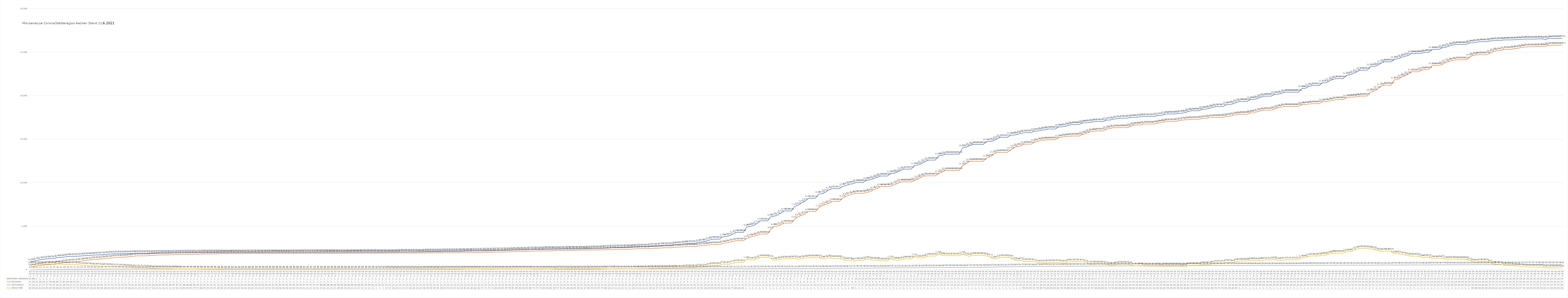
| Category | Positiv Getestete | Genesene | Verstorbene | Aktive Fälle |
|---|---|---|---|---|
| 3/31/20 | 922 | 322 | 15 | 585 |
| 4/1/20 | 980 | 364 | 16 | 600 |
| 4/2/20 | 1081 | 435 | 21 | 625 |
| 4/3/20 | 1155 | 494 | 27 | 634 |
| 4/4/20 | 1213 | 560 | 27 | 626 |
| 4/5/20 | 1259 | 578 | 27 | 654 |
| 4/6/20 | 1272 | 595 | 35 | 642 |
| 4/7/20 | 1295 | 662 | 35 | 598 |
| 4/8/20 | 1399 | 699 | 36 | 664 |
| 4/9/20 | 1426 | 755 | 41 | 630 |
| 4/10/20 | 1465 | 826 | 48 | 591 |
| 4/11/20 | 1508 | 854 | 50 | 604 |
| 4/12/20 | 1532 | 906 | 51 | 575 |
| 4/13/20 | 1547 | 922 | 51 | 574 |
| 4/14/20 | 1557 | 949 | 52 | 556 |
| 4/15/20 | 1583 | 1009 | 54 | 520 |
| 4/16/20 | 1623 | 1058 | 56 | 509 |
| 4/17/20 | 1650 | 1112 | 59 | 479 |
| 4/18/20 | 1669 | 1159 | 62 | 448 |
| 4/19/20 | 1693 | 1195 | 62 | 436 |
| 4/20/20 | 1707 | 1201 | 63 | 443 |
| 4/21/20 | 1719 | 1256 | 65 | 398 |
| 4/22/20 | 1754 | 1281 | 70 | 403 |
| 4/23/20 | 1797 | 1324 | 73 | 400 |
| 4/24/20 | 1812 | 1357 | 74 | 381 |
| 4/25/20 | 1824 | 1412 | 75 | 337 |
| 4/26/20 | 1835 | 1420 | 76 | 339 |
| 4/27/20 | 1839 | 1435 | 76 | 328 |
| 4/28/20 | 1845 | 1467 | 78 | 300 |
| 4/29/20 | 1853 | 1490 | 79 | 284 |
| 4/30/20 | 1866 | 1535 | 82 | 249 |
| 5/1/20 | 1891 | 1591 | 83 | 217 |
| 5/2/20 | 1891 | 1591 | 83 | 217 |
| 5/3/20 | 1891 | 1591 | 83 | 217 |
| 5/4/20 | 1885 | 1598 | 83 | 204 |
| 5/5/20 | 1890 | 1636 | 84 | 170 |
| 5/6/20 | 1895 | 1664 | 84 | 147 |
| 5/7/20 | 1903 | 1682 | 85 | 136 |
| 5/8/20 | 1909 | 1702 | 85 | 122 |
| 5/9/20 | 1909 | 1702 | 85 | 122 |
| 5/10/20 | 1909 | 1702 | 85 | 122 |
| 5/11/20 | 1924 | 1721 | 86 | 117 |
| 5/12/20 | 1929 | 1736 | 87 | 106 |
| 5/13/20 | 1934 | 1743 | 87 | 104 |
| 5/14/20 | 1941 | 1753 | 87 | 101 |
| 5/15/20 | 1945 | 1764 | 88 | 93 |
| 5/16/20 | 1945 | 1764 | 88 | 93 |
| 5/17/20 | 1945 | 1764 | 88 | 93 |
| 5/18/20 | 1951 | 1784 | 88 | 79 |
| 5/19/20 | 1952 | 1791 | 89 | 72 |
| 5/20/20 | 1958 | 1801 | 91 | 66 |
| 5/21/20 | 1960 | 1814 | 91 | 55 |
| 5/22/20 | 1960 | 1814 | 91 | 55 |
| 5/23/20 | 1960 | 1814 | 91 | 55 |
| 5/24/20 | 1960 | 1814 | 91 | 55 |
| 5/25/20 | 1960 | 1829 | 91 | 40 |
| 5/26/20 | 1960 | 1839 | 91 | 30 |
| 5/27/20 | 1962 | 1846 | 92 | 24 |
| 5/28/20 | 1964 | 1849 | 92 | 23 |
| 5/29/20 | 1967 | 1850 | 93 | 24 |
| 5/30/20 | 1967 | 1850 | 93 | 24 |
| 5/31/20 | 1967 | 1850 | 93 | 24 |
| 6/1/20 | 1967 | 1850 | 93 | 24 |
| 6/2/20 | 1971 | 1856 | 93 | 22 |
| 6/3/20 | 1972 | 1858 | 94 | 20 |
| 6/4/20 | 1975 | 1859 | 94 | 22 |
| 6/5/20 | 1976 | 1859 | 94 | 23 |
| 6/6/20 | 1976 | 1859 | 94 | 23 |
| 6/7/20 | 1976 | 1859 | 94 | 23 |
| 6/8/20 | 1979 | 1862 | 94 | 23 |
| 6/9/20 | 1979 | 1863 | 94 | 22 |
| 6/10/20 | 1980 | 1865 | 95 | 20 |
| 6/11/20 | 1982 | 1869 | 95 | 18 |
| 6/12/20 | 1982 | 1869 | 95 | 18 |
| 6/13/20 | 1982 | 1869 | 95 | 18 |
| 6/14/20 | 1982 | 1869 | 95 | 18 |
| 6/15/20 | 1982 | 1871 | 95 | 16 |
| 6/16/20 | 1982 | 1871 | 95 | 16 |
| 6/17/20 | 1985 | 1871 | 95 | 19 |
| 6/18/20 | 1985 | 1871 | 95 | 19 |
| 6/19/20 | 1991 | 1873 | 97 | 21 |
| 6/20/20 | 1991 | 1873 | 97 | 21 |
| 6/21/20 | 1991 | 1873 | 97 | 21 |
| 6/22/20 | 1994 | 1875 | 97 | 22 |
| 6/23/20 | 1994 | 1875 | 97 | 22 |
| 6/24/20 | 1997 | 1876 | 98 | 23 |
| 6/25/20 | 1999 | 1880 | 98 | 21 |
| 6/26/20 | 1999 | 1880 | 98 | 21 |
| 6/27/20 | 1999 | 1880 | 98 | 21 |
| 6/28/20 | 1999 | 1880 | 98 | 21 |
| 6/29/20 | 2001 | 1883 | 98 | 20 |
| 6/30/20 | 2001 | 1883 | 98 | 20 |
| 7/1/20 | 2004 | 1890 | 98 | 16 |
| 7/2/20 | 2004 | 1890 | 98 | 16 |
| 7/3/20 | 2009 | 1898 | 98 | 13 |
| 7/4/20 | 2009 | 1898 | 98 | 13 |
| 7/5/20 | 2009 | 1898 | 98 | 13 |
| 7/6/20 | 2010 | 1900 | 98 | 12 |
| 7/7/20 | 2010 | 1900 | 99 | 11 |
| 7/8/20 | 2010 | 1900 | 99 | 11 |
| 7/9/20 | 2010 | 1900 | 99 | 11 |
| 7/10/20 | 2011 | 1908 | 100 | 3 |
| 7/11/20 | 2011 | 1908 | 100 | 3 |
| 7/12/20 | 2011 | 1908 | 100 | 3 |
| 7/13/20 | 2021 | 1908 | 100 | 13 |
| 7/14/20 | 2021 | 1908 | 100 | 13 |
| 7/15/20 | 2025 | 1909 | 100 | 16 |
| 7/16/20 | 2025 | 1909 | 100 | 16 |
| 7/17/20 | 2030 | 1917 | 100 | 13 |
| 7/18/20 | 2030 | 1917 | 100 | 13 |
| 7/19/20 | 2030 | 1917 | 100 | 13 |
| 7/20/20 | 2037 | 1917 | 100 | 20 |
| 7/21/20 | 2037 | 1917 | 100 | 20 |
| 7/22/20 | 2044 | 1920 | 100 | 24 |
| 7/23/20 | 2044 | 1920 | 100 | 24 |
| 7/24/20 | 2058 | 1922 | 100 | 36 |
| 7/25/20 | 2067 | 1928 | 100 | 39 |
| 7/26/20 | 2067 | 1928 | 100 | 39 |
| 7/27/20 | 2067 | 1928 | 100 | 39 |
| 7/28/20 | 2067 | 1928 | 100 | 39 |
| 7/29/20 | 2076 | 1937 | 100 | 39 |
| 7/30/20 | 2095 | 1942 | 100 | 53 |
| 7/31/20 | 2095 | 1942 | 100 | 53 |
| 8/1/20 | 2095 | 1942 | 100 | 53 |
| 8/2/20 | 2095 | 1942 | 100 | 53 |
| 8/3/20 | 2108 | 1954 | 100 | 54 |
| 8/4/20 | 2108 | 1954 | 100 | 54 |
| 8/5/20 | 2139 | 1958 | 100 | 81 |
| 8/6/20 | 2139 | 1958 | 100 | 81 |
| 8/7/20 | 2157 | 1975 | 100 | 82 |
| 8/8/20 | 2157 | 1975 | 100 | 82 |
| 8/9/20 | 2157 | 1975 | 100 | 82 |
| 8/10/20 | 2170 | 1999 | 100 | 71 |
| 8/11/20 | 2170 | 1999 | 100 | 71 |
| 8/12/20 | 2181 | 2008 | 101 | 72 |
| 8/13/20 | 2181 | 2008 | 101 | 72 |
| 8/14/20 | 2212 | 2028 | 101 | 83 |
| 8/15/20 | 2212 | 2028 | 101 | 83 |
| 8/16/20 | 2212 | 2028 | 101 | 83 |
| 8/17/20 | 2232 | 2053 | 101 | 78 |
| 8/18/20 | 2232 | 2053 | 101 | 78 |
| 8/19/20 | 2261 | 2074 | 102 | 85 |
| 8/20/20 | 2261 | 2074 | 102 | 85 |
| 8/21/20 | 2281 | 2087 | 102 | 92 |
| 8/22/20 | 2281 | 2087 | 102 | 92 |
| 8/23/20 | 2281 | 2087 | 102 | 92 |
| 8/24/20 | 2311 | 2120 | 102 | 89 |
| 8/25/20 | 2324 | 2149 | 102 | 73 |
| 8/26/20 | 2324 | 2149 | 102 | 73 |
| 8/27/20 | 2324 | 2149 | 102 | 73 |
| 8/28/20 | 2348 | 2163 | 102 | 83 |
| 8/29/20 | 2348 | 2163 | 102 | 83 |
| 8/30/20 | 2348 | 2163 | 102 | 83 |
| 8/31/20 | 2353 | 2193 | 102 | 58 |
| 9/1/20 | 2363 | 2203 | 103 | 57 |
| 9/2/20 | 2370 | 2216 | 103 | 51 |
| 9/3/20 | 2378 | 2224 | 103 | 51 |
| 9/4/20 | 2384 | 2235 | 103 | 46 |
| 9/5/20 | 2384 | 2235 | 103 | 46 |
| 9/6/20 | 2384 | 2235 | 103 | 46 |
| 9/7/20 | 2389 | 2247 | 103 | 39 |
| 9/8/20 | 2393 | 2258 | 103 | 32 |
| 9/9/20 | 2400 | 2260 | 103 | 37 |
| 9/10/20 | 2412 | 2263 | 103 | 46 |
| 9/11/20 | 2429 | 2271 | 103 | 55 |
| 9/12/20 | 2429 | 2271 | 103 | 55 |
| 9/13/20 | 2429 | 2271 | 103 | 55 |
| 9/14/20 | 2459 | 2283 | 103 | 73 |
| 9/15/20 | 2477 | 2288 | 103 | 86 |
| 9/16/20 | 2503 | 2297 | 103 | 103 |
| 9/17/20 | 2522 | 2309 | 103 | 110 |
| 9/18/20 | 2550 | 2326 | 103 | 121 |
| 9/19/20 | 2550 | 2326 | 103 | 121 |
| 9/20/20 | 2550 | 2326 | 103 | 121 |
| 9/21/20 | 2568 | 2350 | 104 | 114 |
| 9/22/20 | 2568 | 2350 | 104 | 114 |
| 9/23/20 | 2600 | 2387 | 104 | 109 |
| 9/24/20 | 2621 | 2398 | 104 | 119 |
| 9/25/20 | 2643 | 2415 | 104 | 124 |
| 9/26/20 | 2643 | 2415 | 104 | 124 |
| 9/27/20 | 2643 | 2415 | 104 | 124 |
| 9/28/20 | 2707 | 2442 | 105 | 160 |
| 9/29/20 | 2718 | 2464 | 105 | 149 |
| 9/30/20 | 2734 | 2476 | 106 | 152 |
| 10/1/20 | 2776 | 2495 | 106 | 175 |
| 10/2/20 | 2812 | 2524 | 106 | 182 |
| 10/3/20 | 2812 | 2524 | 106 | 182 |
| 10/4/20 | 2812 | 2524 | 106 | 182 |
| 10/5/20 | 2883 | 2571 | 106 | 206 |
| 10/6/20 | 2891 | 2601 | 107 | 183 |
| 10/7/20 | 2936 | 2617 | 107 | 212 |
| 10/8/20 | 2988 | 2638 | 107 | 243 |
| 10/9/20 | 3027 | 2664 | 109 | 254 |
| 10/10/20 | 3027 | 2664 | 109 | 254 |
| 10/11/20 | 3027 | 2664 | 109 | 254 |
| 10/12/20 | 3167 | 2723 | 109 | 335 |
| 10/13/20 | 3188 | 2772 | 109 | 307 |
| 10/14/20 | 3257 | 2806 | 109 | 342 |
| 10/15/20 | 3393 | 2845 | 109 | 439 |
| 10/16/20 | 3509 | 2891 | 109 | 509 |
| 10/17/20 | 3509 | 2891 | 109 | 509 |
| 10/18/20 | 3509 | 2891 | 109 | 509 |
| 10/19/20 | 3778 | 3016 | 110 | 652 |
| 10/20/20 | 3816 | 3084 | 110 | 622 |
| 10/21/20 | 3912 | 3157 | 110 | 645 |
| 10/22/20 | 4103 | 3237 | 111 | 755 |
| 10/23/20 | 4288 | 3330 | 111 | 847 |
| 10/24/20 | 4288 | 3330 | 111 | 847 |
| 10/25/20 | 4288 | 3330 | 111 | 847 |
| 10/26/20 | 4889 | 3574 | 111 | 1204 |
| 10/27/20 | 4969 | 3734 | 116 | 1119 |
| 10/28/20 | 5082 | 3840 | 119 | 1123 |
| 10/29/20 | 5316 | 3953 | 122 | 1241 |
| 10/30/20 | 5612 | 4093 | 124 | 1395 |
| 10/31/20 | 5612 | 4093 | 124 | 1395 |
| 11/1/20 | 5612 | 4093 | 124 | 1395 |
| 11/2/20 | 6061 | 4610 | 125 | 1326 |
| 11/3/20 | 6153 | 4966 | 129 | 1058 |
| 11/4/20 | 6278 | 5013 | 130 | 1135 |
| 11/5/20 | 6519 | 5166 | 130 | 1223 |
| 11/6/20 | 6748 | 5360 | 132 | 1256 |
| 11/7/20 | 6748 | 5360 | 132 | 1256 |
| 11/8/20 | 6748 | 5360 | 132 | 1256 |
| 11/9/20 | 7273 | 5831 | 132 | 1310 |
| 11/10/20 | 7426 | 6076 | 140 | 1210 |
| 11/11/20 | 7658 | 6237 | 142 | 1279 |
| 11/12/20 | 7871 | 6394 | 143 | 1334 |
| 11/13/20 | 8211 | 6683 | 143 | 1385 |
| 11/14/20 | 8211 | 6683 | 143 | 1385 |
| 11/15/20 | 8211 | 6683 | 143 | 1385 |
| 11/16/20 | 8681 | 7124 | 143 | 1414 |
| 11/17/20 | 8728 | 7322 | 148 | 1258 |
| 11/18/20 | 8920 | 7498 | 148 | 1274 |
| 11/19/20 | 9179 | 7631 | 156 | 1392 |
| 11/20/20 | 9311 | 7849 | 162 | 1300 |
| 11/21/20 | 9311 | 7849 | 162 | 1300 |
| 11/22/20 | 9311 | 7849 | 162 | 1300 |
| 11/23/20 | 9565 | 8230 | 164 | 1171 |
| 11/24/20 | 9676 | 8447 | 168 | 1061 |
| 11/25/20 | 9827 | 8576 | 172 | 1079 |
| 11/26/20 | 9867 | 8698 | 175 | 994 |
| 11/27/20 | 10038 | 8786 | 178 | 1074 |
| 11/28/20 | 10038 | 8786 | 178 | 1074 |
| 11/29/20 | 10038 | 8786 | 178 | 1074 |
| 11/30/20 | 10289 | 8868 | 182 | 1239 |
| 12/1/20 | 10316 | 8968 | 184 | 1164 |
| 12/2/20 | 10460 | 9194 | 188 | 1078 |
| 12/3/20 | 10605 | 9314 | 191 | 1100 |
| 12/4/20 | 10764 | 9548 | 196 | 1020 |
| 12/5/20 | 10764 | 9548 | 196 | 1020 |
| 12/6/20 | 10764 | 9548 | 196 | 1020 |
| 12/7/20 | 11053 | 9586 | 197 | 1270 |
| 12/8/20 | 11080 | 9730 | 211 | 1139 |
| 12/9/20 | 11222 | 9915 | 213 | 1094 |
| 12/10/20 | 11442 | 10086 | 213 | 1143 |
| 12/11/20 | 11557 | 10095 | 214 | 1248 |
| 12/12/20 | 11557 | 10095 | 214 | 1248 |
| 12/13/20 | 11557 | 10095 | 214 | 1248 |
| 12/14/20 | 11970 | 10237 | 219 | 1514 |
| 12/15/20 | 12025 | 10461 | 219 | 1345 |
| 12/16/20 | 12197 | 10640 | 232 | 1325 |
| 12/17/20 | 12415 | 10773 | 240 | 1402 |
| 12/18/20 | 12592 | 10783 | 242 | 1567 |
| 12/19/20 | 12592 | 10783 | 242 | 1567 |
| 12/20/20 | 12592 | 10783 | 242 | 1567 |
| 12/21/20 | 13089 | 11054 | 246 | 1789 |
| 12/22/20 | 13144 | 11232 | 246 | 1666 |
| 12/23/20 | 13276 | 11409 | 256 | 1611 |
| 12/24/20 | 13276 | 11409 | 256 | 1611 |
| 12/25/20 | 13276 | 11409 | 256 | 1611 |
| 12/26/20 | 13276 | 11409 | 256 | 1611 |
| 12/27/20 | 13276 | 11409 | 256 | 1611 |
| 12/28/20 | 14012 | 11950 | 263 | 1799 |
| 12/29/20 | 14078 | 12189 | 265 | 1624 |
| 12/30/20 | 14248 | 12435 | 272 | 1541 |
| 12/31/20 | 14395 | 12460 | 276 | 1659 |
| 1/1/21 | 14395 | 12460 | 276 | 1659 |
| 1/2/21 | 14395 | 12460 | 276 | 1659 |
| 1/3/21 | 14395 | 12460 | 276 | 1659 |
| 1/4/21 | 14721 | 12848 | 292 | 1581 |
| 1/5/21 | 14723 | 12949 | 301 | 1473 |
| 1/6/21 | 14832 | 13293 | 310 | 1229 |
| 1/7/21 | 15028 | 13437 | 319 | 1272 |
| 1/8/21 | 15211 | 13473 | 325 | 1413 |
| 1/9/21 | 15211 | 13473 | 325 | 1413 |
| 1/10/21 | 15211 | 13473 | 325 | 1413 |
| 1/11/21 | 15460 | 13759 | 335 | 1366 |
| 1/12/21 | 15469 | 14015 | 340 | 1114 |
| 1/13/21 | 15548 | 14173 | 347 | 1028 |
| 1/14/21 | 15657 | 14233 | 347 | 1077 |
| 1/15/21 | 15745 | 14431 | 359 | 955 |
| 1/16/21 | 15745 | 14431 | 359 | 955 |
| 1/17/21 | 15745 | 14431 | 359 | 955 |
| 1/18/21 | 15931 | 14657 | 362 | 912 |
| 1/19/21 | 15933 | 14772 | 370 | 791 |
| 1/20/21 | 16037 | 14857 | 380 | 800 |
| 1/21/21 | 16081 | 14908 | 390 | 783 |
| 1/22/21 | 16164 | 14930 | 393 | 841 |
| 1/23/21 | 16164 | 14930 | 393 | 841 |
| 1/24/21 | 16164 | 14930 | 393 | 841 |
| 1/25/21 | 16399 | 15168 | 393 | 838 |
| 1/26/21 | 16415 | 15229 | 398 | 788 |
| 1/27/21 | 16478 | 15299 | 399 | 780 |
| 1/28/21 | 16602 | 15315 | 399 | 888 |
| 1/29/21 | 16688 | 15360 | 405 | 923 |
| 1/30/21 | 16688 | 15360 | 405 | 923 |
| 1/31/21 | 16688 | 15360 | 405 | 923 |
| 2/1/21 | 16866 | 15540 | 416 | 910 |
| 2/2/21 | 16871 | 15644 | 417 | 810 |
| 2/3/21 | 16914 | 15817 | 420 | 677 |
| 2/4/21 | 16984 | 15886 | 420 | 678 |
| 2/5/21 | 17029 | 15937 | 427 | 665 |
| 2/6/21 | 17029 | 15937 | 427 | 665 |
| 2/7/21 | 17029 | 15937 | 427 | 665 |
| 2/8/21 | 17191 | 16150 | 430 | 611 |
| 2/9/21 | 17198 | 16225 | 435 | 538 |
| 2/10/21 | 17301 | 16316 | 437 | 548 |
| 2/11/21 | 17352 | 16314 | 437 | 601 |
| 2/12/21 | 17416 | 16328 | 443 | 645 |
| 2/13/21 | 17416 | 16328 | 443 | 645 |
| 2/14/21 | 17416 | 16328 | 443 | 645 |
| 2/15/21 | 17499 | 16463 | 447 | 589 |
| 2/16/21 | 17502 | 16612 | 447 | 443 |
| 2/17/21 | 17530 | 16635 | 448 | 447 |
| 2/18/21 | 17582 | 16651 | 448 | 483 |
| 2/19/21 | 17611 | 16744 | 455 | 412 |
| 2/20/21 | 17611 | 16744 | 455 | 412 |
| 2/21/21 | 17611 | 16744 | 455 | 412 |
| 2/22/21 | 17611 | 16744 | 455 | 412 |
| 2/23/21 | 17720 | 16859 | 455 | 406 |
| 2/24/21 | 17722 | 16899 | 457 | 366 |
| 2/25/21 | 17858 | 16987 | 465 | 406 |
| 2/26/21 | 17896 | 17033 | 465 | 398 |
| 2/27/21 | 17896 | 17033 | 465 | 398 |
| 2/28/21 | 17896 | 17033 | 465 | 398 |
| 3/1/21 | 17971 | 17110 | 466 | 395 |
| 3/2/21 | 17984 | 17178 | 466 | 340 |
| 3/3/21 | 18062 | 17228 | 468 | 366 |
| 3/4/21 | 18194 | 17244 | 470 | 480 |
| 3/5/21 | 18266 | 17295 | 470 | 501 |
| 3/6/21 | 18266 | 17295 | 470 | 501 |
| 3/7/21 | 18266 | 17295 | 470 | 501 |
| 3/8/21 | 18445 | 17383 | 473 | 589 |
| 3/9/21 | 18451 | 17388 | 474 | 589 |
| 3/10/21 | 18548 | 17451 | 474 | 623 |
| 3/11/21 | 18651 | 17493 | 475 | 683 |
| 3/12/21 | 18747 | 17508 | 476 | 763 |
| 3/13/21 | 18747 | 17508 | 476 | 763 |
| 3/14/21 | 18747 | 17508 | 476 | 763 |
| 3/15/21 | 18967 | 17633 | 479 | 855 |
| 3/16/21 | 18970 | 17638 | 481 | 851 |
| 3/17/21 | 19075 | 17749 | 482 | 844 |
| 3/18/21 | 19232 | 17800 | 482 | 950 |
| 3/19/21 | 19348 | 17864 | 484 | 1000 |
| 3/20/21 | 19348 | 17864 | 484 | 1000 |
| 3/21/21 | 19348 | 17864 | 484 | 1000 |
| 3/22/21 | 19559 | 18009 | 486 | 1064 |
| 3/23/21 | 19563 | 18017 | 489 | 1057 |
| 3/24/21 | 19663 | 18151 | 490 | 1022 |
| 3/25/21 | 19832 | 18252 | 491 | 1089 |
| 3/26/21 | 19939 | 18325 | 493 | 1121 |
| 3/27/21 | 19939 | 18325 | 493 | 1121 |
| 3/28/21 | 19939 | 18325 | 493 | 1121 |
| 3/29/21 | 20141 | 18444 | 493 | 1204 |
| 3/30/21 | 20162 | 18593 | 495 | 1074 |
| 3/31/21 | 20247 | 18675 | 495 | 1077 |
| 4/1/21 | 20398 | 18766 | 495 | 1137 |
| 4/2/21 | 20398 | 18766 | 495 | 1137 |
| 4/3/21 | 20398 | 18766 | 495 | 1137 |
| 4/4/21 | 20398 | 18766 | 495 | 1137 |
| 4/5/21 | 20398 | 18766 | 495 | 1137 |
| 4/6/21 | 20818 | 18950 | 499 | 1369 |
| 4/7/21 | 20835 | 18974 | 499 | 1362 |
| 4/8/21 | 21070 | 19035 | 504 | 1531 |
| 4/9/21 | 21163 | 19079 | 505 | 1579 |
| 4/10/21 | 21163 | 19079 | 505 | 1579 |
| 4/11/21 | 21163 | 19079 | 505 | 1579 |
| 4/12/21 | 21473 | 19285 | 505 | 1683 |
| 4/13/21 | 21482 | 19309 | 510 | 1663 |
| 4/14/21 | 21688 | 19390 | 515 | 1783 |
| 4/15/21 | 21861 | 19457 | 516 | 1888 |
| 4/16/21 | 21963 | 19544 | 518 | 1901 |
| 4/17/21 | 21963 | 19544 | 518 | 1901 |
| 4/18/21 | 21963 | 19544 | 518 | 1901 |
| 4/19/21 | 22329 | 19753 | 523 | 2053 |
| 4/20/21 | 22407 | 19820 | 523 | 2064 |
| 4/21/21 | 22536 | 19838 | 523 | 2175 |
| 4/22/21 | 22736 | 19860 | 524 | 2352 |
| 4/23/21 | 22926 | 19951 | 524 | 2451 |
| 4/24/21 | 22926 | 19951 | 524 | 2451 |
| 4/25/21 | 22926 | 19951 | 524 | 2451 |
| 4/26/21 | 23325 | 20410 | 525 | 2390 |
| 4/27/21 | 23349 | 20496 | 525 | 2328 |
| 4/28/21 | 23454 | 20743 | 528 | 2183 |
| 4/29/21 | 23708 | 21070 | 531 | 2107 |
| 4/30/21 | 23886 | 21205 | 532 | 2149 |
| 5/1/21 | 23887 | 21206 | 532 | 2149 |
| 5/2/21 | 23888 | 21207 | 532 | 2149 |
| 5/3/21 | 24183 | 21817 | 534 | 1832 |
| 5/4/21 | 24236 | 21855 | 538 | 1843 |
| 5/5/21 | 24385 | 22099 | 541 | 1745 |
| 5/6/21 | 24512 | 22268 | 543 | 1701 |
| 5/7/21 | 24611 | 22456 | 543 | 1612 |
| 5/8/21 | 24849 | 22741 | 547 | 1561 |
| 5/9/21 | 24849 | 22741 | 547 | 1561 |
| 5/10/21 | 24849 | 22741 | 547 | 1561 |
| 5/11/21 | 24885 | 22930 | 549 | 1406 |
| 5/12/21 | 24988 | 23004 | 549 | 1435 |
| 5/13/21 | 24988 | 23004 | 549 | 1435 |
| 5/14/21 | 25306 | 23458 | 554 | 1294 |
| 5/15/21 | 25307 | 23459 | 554 | 1294 |
| 5/16/21 | 25308 | 23460 | 554 | 1294 |
| 5/17/21 | 25503 | 23595 | 557 | 1351 |
| 5/18/21 | 25559 | 23799 | 560 | 1200 |
| 5/19/21 | 25704 | 23943 | 560 | 1201 |
| 5/20/21 | 25820 | 24030 | 560 | 1230 |
| 5/21/21 | 25884 | 24122 | 562 | 1200 |
| 5/22/21 | 25885 | 24123 | 562 | 1200 |
| 5/23/21 | 25886 | 24124 | 562 | 1200 |
| 5/24/21 | 25887 | 24125 | 562 | 1200 |
| 5/25/21 | 26059 | 24464 | 562 | 1033 |
| 5/26/21 | 26077 | 24616 | 565 | 896 |
| 5/27/21 | 26143 | 24685 | 568 | 890 |
| 5/28/21 | 26200 | 24704 | 568 | 928 |
| 5/29/21 | 26201 | 24705 | 568 | 928 |
| 5/30/21 | 26202 | 24706 | 568 | 928 |
| 5/31/21 | 26290 | 24913 | 570 | 807 |
| 6/1/21 | 26311 | 25083 | 570 | 658 |
| 6/2/21 | 26355 | 25174 | 571 | 610 |
| 6/3/21 | 26356 | 25175 | 571 | 610 |
| 6/4/21 | 26400 | 25321 | 574 | 505 |
| 6/5/21 | 26401 | 25322 | 574 | 505 |
| 6/6/21 | 26402 | 25323 | 574 | 505 |
| 6/7/21 | 26428 | 25401 | 575 | 452 |
| 6/8/21 | 26438 | 25438 | 576 | 424 |
| 6/9/21 | 26478 | 25528 | 577 | 373 |
| 6/10/21 | 26495 | 25577 | 577 | 341 |
| 6/11/21 | 26501 | 25623 | 577 | 301 |
| 6/12/21 | 26501 | 25623 | 577 | 301 |
| 6/13/21 | 26501 | 25623 | 577 | 301 |
| 6/14/21 | 26524 | 25654 | 578 | 292 |
| 6/15/21 | 26534 | 25654 | 578 | 302 |
| 6/16/21 | 26454 | 25669 | 579 | 206 |
| 6/17/21 | 26566 | 25777 | 579 | 210 |
| 6/18/21 | 26575 | 25790 | 579 | 206 |
| 6/19/21 | 26576 | 25791 | 579 | 206 |
| 6/20/21 | 26577 | 25792 | 579 | 206 |
| 6/21/21 | 26591 | 25815 | 580 | 196 |